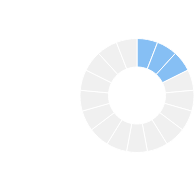
| Category | 3. quarter (expected) |
|---|---|
| 0 | 1 |
| 1 | 1 |
| 2 | 1 |
| 3 | 1 |
| 4 | 1 |
| 5 | 1 |
| 6 | 1 |
| 7 | 1 |
| 8 | 1 |
| 9 | 1 |
| 10 | 1 |
| 11 | 1 |
| 12 | 1 |
| 13 | 1 |
| 14 | 1 |
| 15 | 1 |
| 16 | 1 |